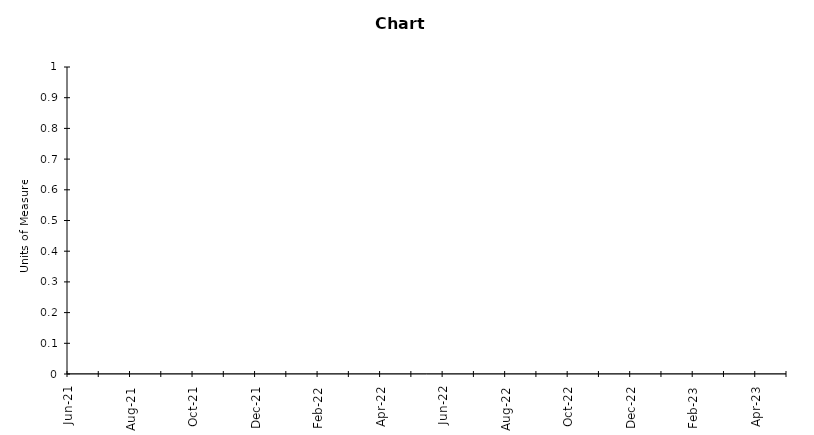
| Category | Data | Median |
|---|---|---|
| 2021-06-01 |  | 0 |
| 2021-07-01 |  | 0 |
| 2021-08-01 |  | 0 |
| 2021-09-01 |  | 0 |
| 2021-10-01 |  | 0 |
| 2021-11-01 |  | 0 |
| 2021-12-01 |  | 0 |
| 2022-01-01 |  | 0 |
| 2022-02-01 |  | 0 |
| 2022-03-01 |  | 0 |
| 2022-04-01 |  | 0 |
| 2022-05-01 |  | 0 |
| 2022-06-01 |  | 0 |
| 2022-07-01 |  | 0 |
| 2022-08-01 |  | 0 |
| 2022-09-01 |  | 0 |
| 2022-10-01 |  | 0 |
| 2022-11-01 |  | 0 |
| 2022-12-01 |  | 0 |
| 2023-01-01 |  | 0 |
| 2023-02-01 |  | 0 |
| 2023-03-01 |  | 0 |
| 2023-04-01 |  | 0 |
| 2023-05-01 |  | 0 |